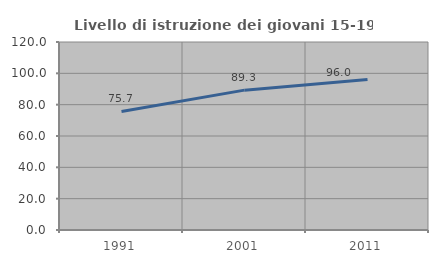
| Category | Livello di istruzione dei giovani 15-19 anni |
|---|---|
| 1991.0 | 75.658 |
| 2001.0 | 89.268 |
| 2011.0 | 96.046 |